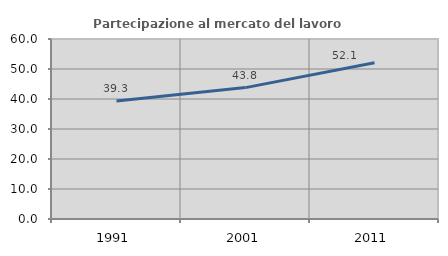
| Category | Partecipazione al mercato del lavoro  femminile |
|---|---|
| 1991.0 | 39.312 |
| 2001.0 | 43.796 |
| 2011.0 | 52.083 |